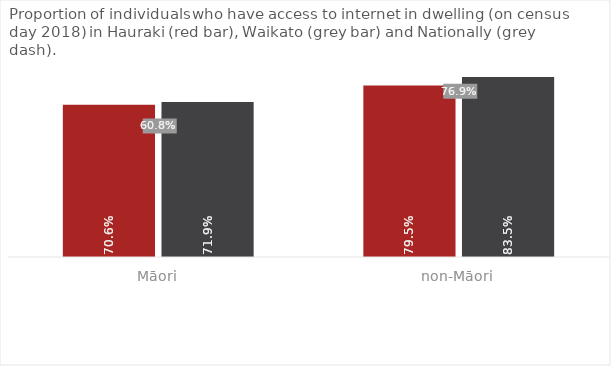
| Category | Hauraki | Waikato |
|---|---|---|
| Māori | 0.706 | 0.719 |
| non-Māori | 0.795 | 0.835 |